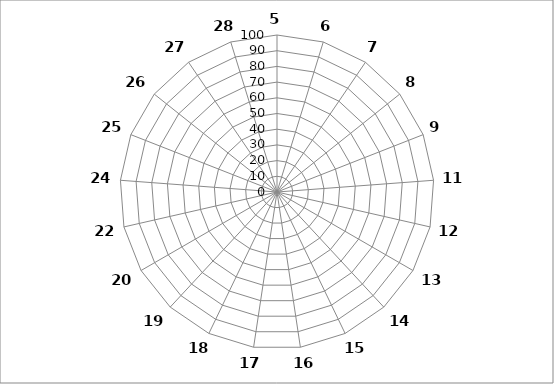
| Category | Series 0 |
|---|---|
| 5.0 | 0 |
| 6.0 | 0 |
| 7.0 | 0 |
| 8.0 | 0 |
| 9.0 | 0 |
| 11.0 | 0 |
| 12.0 | 0 |
| 13.0 | 0 |
| 14.0 | 0 |
| 15.0 | 0 |
| 16.0 | 0 |
| 17.0 | 0 |
| 18.0 | 0 |
| 19.0 | 0 |
| 20.0 | 0 |
| 22.0 | 0 |
| 24.0 | 0 |
| 25.0 | 0 |
| 26.0 | 0 |
| 27.0 | 0 |
| 28.0 | 0 |